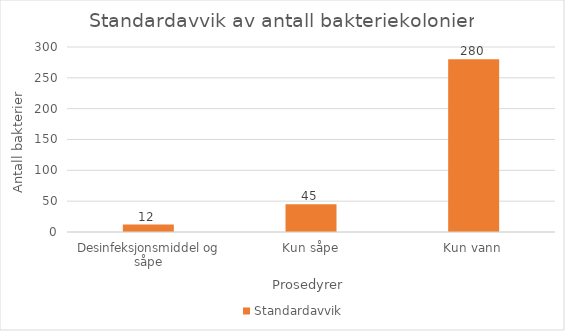
| Category | Standardavvik |
|---|---|
| Desinfeksjonsmiddel og såpe | 12 |
| Kun såpe | 45 |
| Kun vann | 280 |